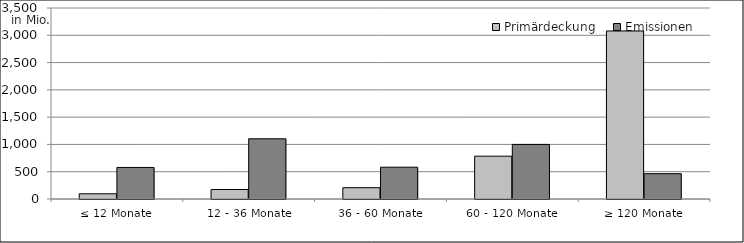
| Category | Primärdeckung | Emissionen |
|---|---|---|
| ≤ 12 Monate | 95611397.38 | 578000000 |
| 12 - 36 Monate | 173737610.24 | 1103378446.27 |
| 36 - 60 Monate | 206863640.095 | 582650000 |
| 60 - 120 Monate | 784590193.63 | 1000000000 |
| ≥ 120 Monate | 3079050323.947 | 463733665.9 |